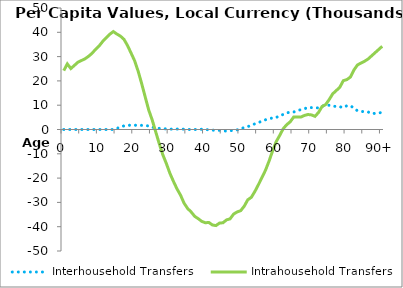
| Category | Interhousehold Transfers | Intrahousehold Transfers |
|---|---|---|
| 0 | 0 | 24219.385 |
|  | 0 | 27001.633 |
| 2 | 0 | 25081.131 |
| 3 | 0 | 26373.823 |
| 4 | 0 | 27689.099 |
| 5 | 0 | 28393.296 |
| 6 | 0 | 29079.438 |
| 7 | 0 | 30121.116 |
| 8 | 0 | 31368.519 |
| 9 | 0 | 33013.113 |
| 10 | 0 | 34377.362 |
| 11 | 0 | 36244.128 |
| 12 | 0 | 37722.302 |
| 13 | 0 | 39189.806 |
| 14 | 0 | 40294.143 |
| 15 | 459.025 | 39293.786 |
| 16 | 967.935 | 38444.997 |
| 17 | 1476.844 | 37135.238 |
| 18 | 1690.306 | 34605.542 |
| 19 | 1791.402 | 31516.47 |
| 20 | 1810.596 | 28356.845 |
| 21 | 1618.203 | 24092.428 |
| 22 | 1705.396 | 18975.695 |
| 23 | 1582.224 | 13484.652 |
| 24 | 1466.742 | 8058.031 |
| 25 | 976.894 | 3886.685 |
| 26 | 534.821 | -1040.405 |
| 27 | 476.251 | -5915.317 |
| 28 | 327.375 | -10418.484 |
| 29 | 251.336 | -14057.477 |
| 30 | 197.898 | -18038.319 |
| 31 | 82.211 | -21358.075 |
| 32 | 199.111 | -24443.433 |
| 33 | 156.057 | -27014.179 |
| 34 | 162.828 | -30328.033 |
| 35 | 89.604 | -32520.792 |
| 36 | -76.404 | -33935.156 |
| 37 | 7.716 | -35734.83 |
| 38 | -39.42 | -36708.047 |
| 39 | 123.024 | -37802.933 |
| 40 | -26.035 | -38371.935 |
| 41 | -108.453 | -38251.428 |
| 42 | -247.758 | -39282.897 |
| 43 | -362.325 | -39544.674 |
| 44 | -360.615 | -38525.972 |
| 45 | -570.367 | -38372.388 |
| 46 | -637.318 | -37189.458 |
| 47 | -447.298 | -36769.647 |
| 48 | -427.735 | -34802.159 |
| 49 | -156.201 | -33916.878 |
| 50 | 96.148 | -33403.437 |
| 51 | 888.381 | -31556.946 |
| 52 | 1178.93 | -28924.866 |
| 53 | 1738.078 | -27922.656 |
| 54 | 2327.378 | -25517.484 |
| 55 | 2782.852 | -22738.134 |
| 56 | 3549.212 | -19792.114 |
| 57 | 3990.977 | -16792.13 |
| 58 | 4288.651 | -13067.138 |
| 59 | 4816.336 | -8863.742 |
| 60 | 4851.227 | -5085.78 |
| 61 | 5770.971 | -2508.147 |
| 62 | 6170.313 | 284.751 |
| 63 | 6802.9 | 1974.266 |
| 64 | 7178.277 | 3178.393 |
| 65 | 7193.16 | 5179.142 |
| 66 | 7834.416 | 5173.081 |
| 67 | 8142.242 | 5117.722 |
| 68 | 8448.289 | 5769.435 |
| 69 | 9156.511 | 6171.435 |
| 70 | 9001.801 | 6010.519 |
| 71 | 8919.673 | 5407.568 |
| 72 | 8902.866 | 7018.229 |
| 73 | 9552.242 | 9468.119 |
| 74 | 10022.5 | 10254.939 |
| 75 | 9960.741 | 12287.98 |
| 76 | 9536.519 | 14677.151 |
| 77 | 9533.188 | 16011.445 |
| 78 | 9386.84 | 17363.64 |
| 79 | 8989.203 | 20092.301 |
| 80 | 9785.432 | 20523.719 |
| 81 | 9788.805 | 21587.353 |
| 82 | 8762.107 | 24496.392 |
| 83 | 7711.98 | 26551.494 |
| 84 | 7391.048 | 27354.294 |
| 85 | 7396.081 | 28086.299 |
| 86 | 7243.089 | 29001.668 |
| 87 | 6510.446 | 30312.159 |
| 88 | 6674.014 | 31622.65 |
| 89 | 6837.582 | 32933.141 |
| 90+ | 7001.15 | 34244.596 |